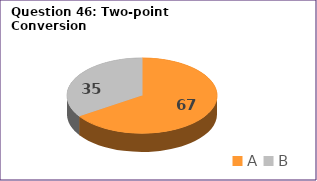
| Category | Series 0 |
|---|---|
| A | 67 |
| B | 35 |